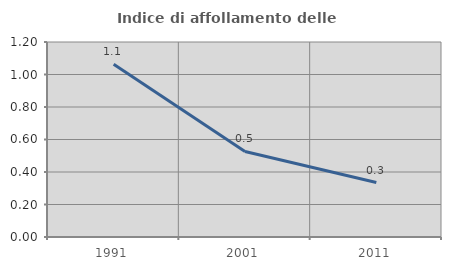
| Category | Indice di affollamento delle abitazioni  |
|---|---|
| 1991.0 | 1.064 |
| 2001.0 | 0.526 |
| 2011.0 | 0.335 |